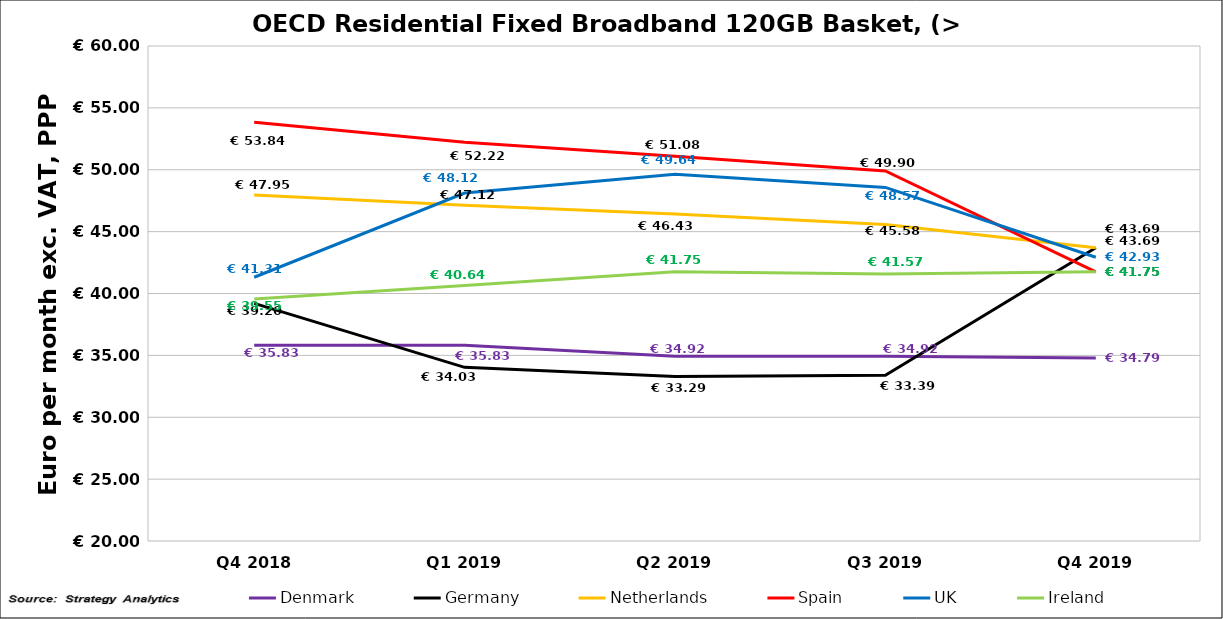
| Category | Denmark | Germany | Netherlands | Spain | UK | Ireland |
|---|---|---|---|---|---|---|
| Q4 2018 | 35.827 | 39.202 | 47.95 | 53.837 | 41.314 | 39.55 |
| Q1 2019 | 35.827 | 34.031 | 47.124 | 52.218 | 48.117 | 40.637 |
| Q2 2019 | 34.92 | 33.291 | 46.43 | 51.083 | 49.639 | 41.751 |
| Q3 2019 | 34.92 | 33.387 | 45.579 | 49.901 | 48.572 | 41.569 |
| Q4 2019 | 34.79 | 43.69 | 43.69 | 41.75 | 42.93 | 41.75 |